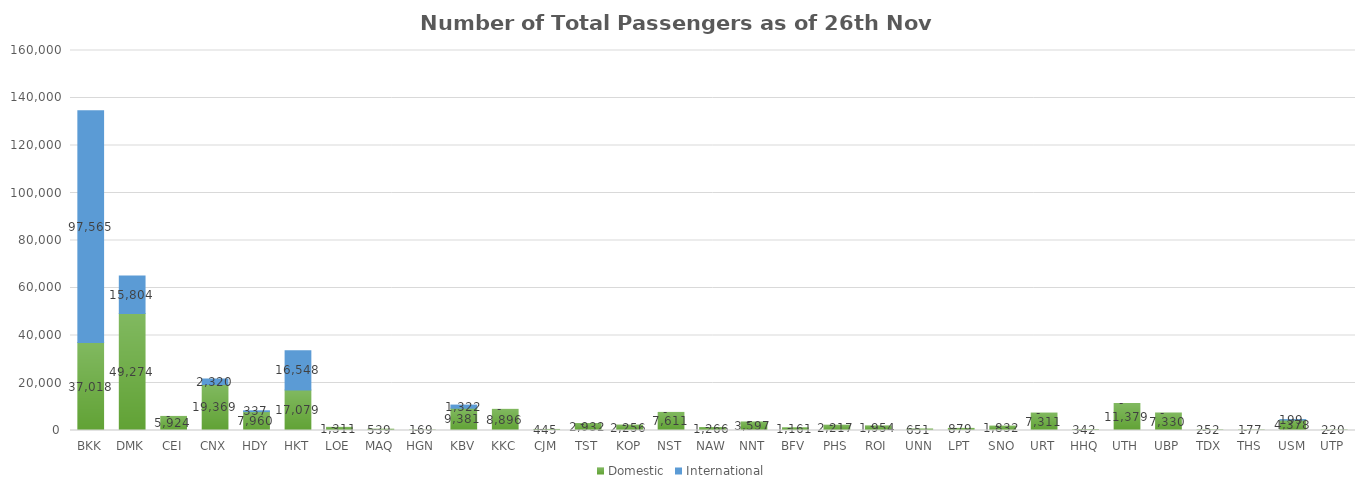
| Category | Domestic | International |
|---|---|---|
| BKK | 37018 | 97565 |
| DMK | 49274 | 15804 |
| CEI | 5924 | 0 |
| CNX | 19369 | 2320 |
| HDY | 7960 | 337 |
| HKT | 17079 | 16548 |
| LOE | 1311 | 0 |
| MAQ | 539 | 0 |
| HGN | 169 | 0 |
| KBV | 9381 | 1322 |
| KKC | 8896 | 0 |
| CJM | 445 | 0 |
| TST | 2932 | 0 |
| KOP | 2256 | 0 |
| NST | 7611 | 0 |
| NAW | 1266 | 0 |
| NNT | 3597 | 0 |
| BFV | 1161 | 0 |
| PHS | 2217 | 0 |
| ROI | 1954 | 0 |
| UNN | 651 | 0 |
| LPT | 879 | 0 |
| SNO | 1832 | 0 |
| URT | 7311 | 0 |
| HHQ | 342 | 0 |
| UTH | 11379 | 0 |
| UBP | 7330 | 0 |
| TDX | 252 | 0 |
| THS | 177 | 0 |
| USM | 4378 | 199 |
| UTP | 220 | 0 |